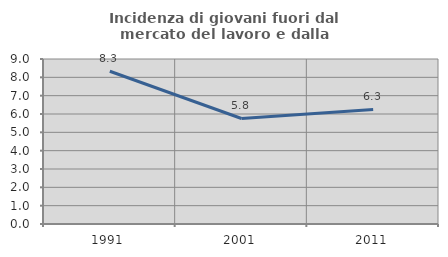
| Category | Incidenza di giovani fuori dal mercato del lavoro e dalla formazione  |
|---|---|
| 1991.0 | 8.333 |
| 2001.0 | 5.755 |
| 2011.0 | 6.25 |